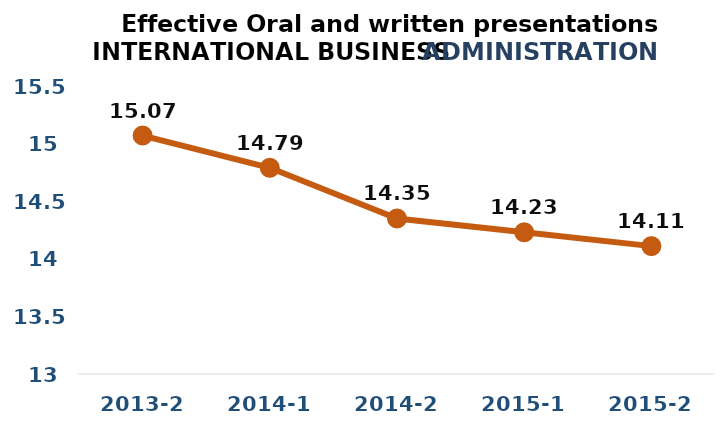
| Category | Series 0 |
|---|---|
| 2013-2 | 15.07 |
| 2014-1 | 14.79 |
| 2014-2 | 14.35 |
| 2015-1 | 14.23 |
| 2015-2 | 14.11 |